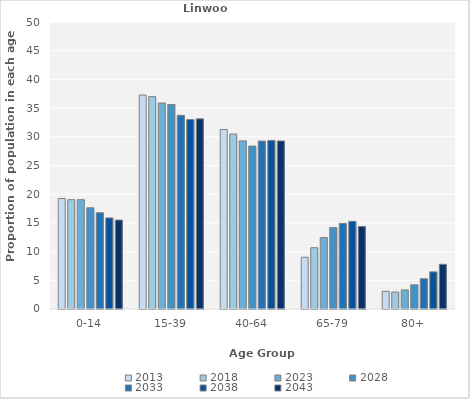
| Category | 2013 | 2018 | 2023 | 2028 | 2033 | 2038 | 2043 |
|---|---|---|---|---|---|---|---|
| 0-14 | 19.259 | 19.04 | 19.051 | 17.638 | 16.772 | 15.873 | 15.502 |
| 15-39 | 37.284 | 37 | 35.889 | 35.63 | 33.74 | 33.016 | 33.133 |
| 40-64 | 31.276 | 30.48 | 29.289 | 28.386 | 29.252 | 29.365 | 29.277 |
| 65-79 | 9.012 | 10.68 | 12.451 | 14.173 | 14.921 | 15.278 | 14.378 |
| 80+ | 3.086 | 2.96 | 3.32 | 4.213 | 5.276 | 6.468 | 7.791 |